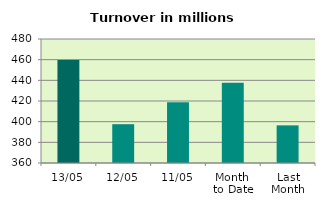
| Category | Series 0 |
|---|---|
| 13/05 | 459.619 |
| 12/05 | 397.553 |
| 11/05 | 418.776 |
| Month 
to Date | 437.733 |
| Last
Month | 396.429 |